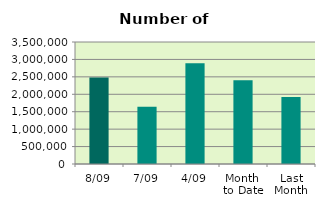
| Category | Series 0 |
|---|---|
| 8/09 | 2484404 |
| 7/09 | 1639110 |
| 4/09 | 2889244 |
| Month 
to Date | 2405178.333 |
| Last
Month | 1925290.095 |